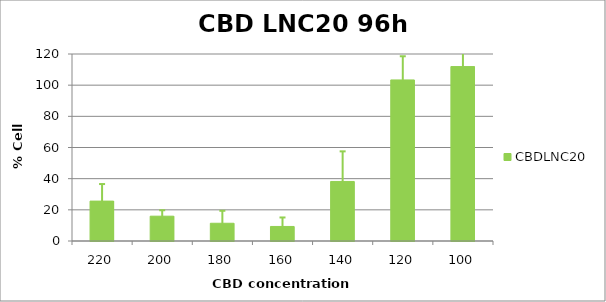
| Category | CBDLNC20 |
|---|---|
| 220.0 | 25.6 |
| 200.0 | 15.923 |
| 180.0 | 11.385 |
| 160.0 | 9.334 |
| 140.0 | 38.206 |
| 120.0 | 103.362 |
| 100.0 | 111.938 |